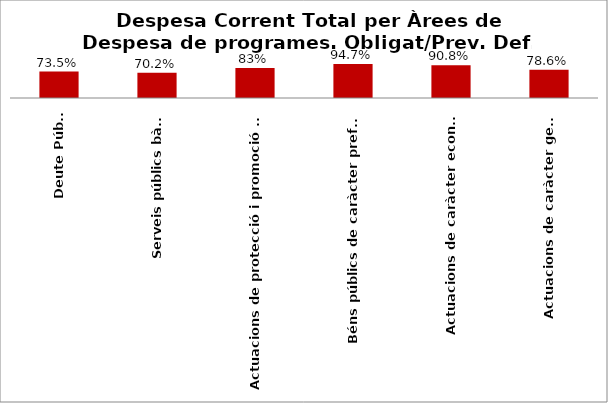
| Category | Series 0 |
|---|---|
| Deute Públic | 0.735 |
| Serveis públics bàsics | 0.702 |
| Actuacions de protecció i promoció social | 0.832 |
| Béns públics de caràcter preferent | 0.947 |
| Actuacions de caràcter econòmic | 0.908 |
| Actuacions de caràcter general | 0.786 |